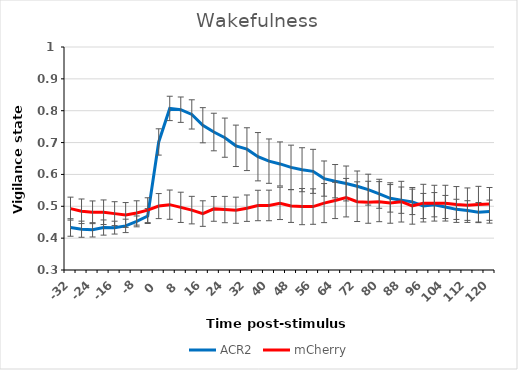
| Category | ACR2 | mCherry |
|---|---|---|
| -32.0 | 0.433 | 0.493 |
| -28.0 | 0.428 | 0.484 |
| -24.0 | 0.426 | 0.481 |
| -20.0 | 0.433 | 0.481 |
| -16.0 | 0.433 | 0.477 |
| -12.0 | 0.438 | 0.473 |
| -8.0 | 0.453 | 0.479 |
| -4.0 | 0.469 | 0.488 |
| 0.0 | 0.702 | 0.501 |
| 4.0 | 0.807 | 0.505 |
| 8.0 | 0.803 | 0.497 |
| 12.0 | 0.788 | 0.488 |
| 16.0 | 0.754 | 0.477 |
| 20.0 | 0.733 | 0.492 |
| 24.0 | 0.715 | 0.49 |
| 28.0 | 0.69 | 0.488 |
| 32.0 | 0.679 | 0.494 |
| 36.0 | 0.656 | 0.502 |
| 40.0 | 0.642 | 0.503 |
| 44.0 | 0.633 | 0.509 |
| 48.0 | 0.622 | 0.501 |
| 52.0 | 0.615 | 0.499 |
| 56.0 | 0.61 | 0.499 |
| 60.0 | 0.587 | 0.51 |
| 64.0 | 0.579 | 0.518 |
| 68.0 | 0.572 | 0.527 |
| 72.0 | 0.563 | 0.514 |
| 76.0 | 0.552 | 0.513 |
| 80.0 | 0.539 | 0.515 |
| 84.0 | 0.525 | 0.51 |
| 88.0 | 0.519 | 0.514 |
| 92.0 | 0.514 | 0.501 |
| 96.0 | 0.501 | 0.51 |
| 100.0 | 0.505 | 0.51 |
| 104.0 | 0.498 | 0.51 |
| 108.0 | 0.49 | 0.506 |
| 112.0 | 0.487 | 0.503 |
| 116.0 | 0.481 | 0.506 |
| 120.0 | 0.483 | 0.507 |